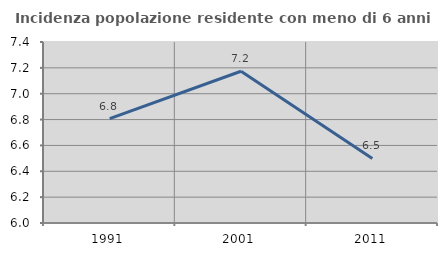
| Category | Incidenza popolazione residente con meno di 6 anni |
|---|---|
| 1991.0 | 6.807 |
| 2001.0 | 7.174 |
| 2011.0 | 6.499 |